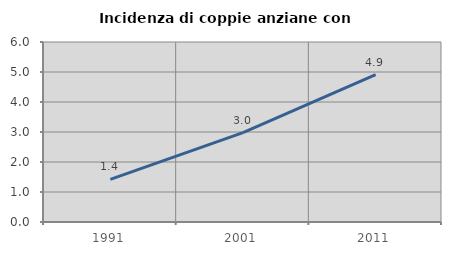
| Category | Incidenza di coppie anziane con figli |
|---|---|
| 1991.0 | 1.418 |
| 2001.0 | 2.979 |
| 2011.0 | 4.913 |